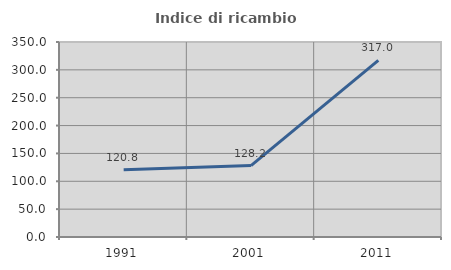
| Category | Indice di ricambio occupazionale  |
|---|---|
| 1991.0 | 120.833 |
| 2001.0 | 128.169 |
| 2011.0 | 316.981 |